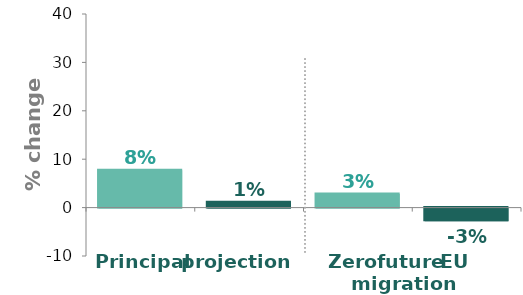
| Category | Series 0 |
|---|---|
| UK principal projection | 7.724 |
| Scotland principal projection | 1.094 |
| UK Zero future EU migration variant | 2.829 |
| Scotland Zero future EU migration variant | -2.594 |